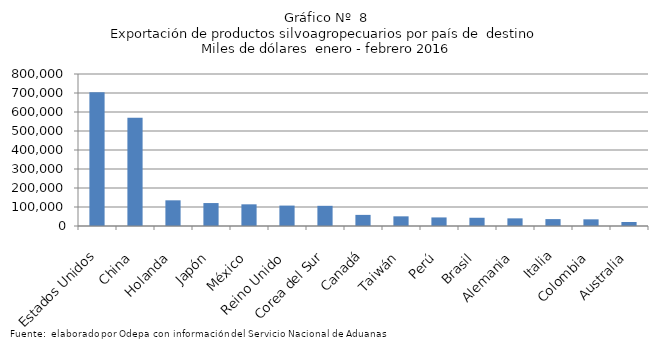
| Category | Series 0 |
|---|---|
| Estados Unidos | 704222.246 |
| China | 570098.945 |
| Holanda | 135188.003 |
| Japón | 120776.754 |
| México | 114056.644 |
| Reino Unido | 107442.036 |
| Corea del Sur | 106201.218 |
| Canadá | 58504.005 |
| Taiwán | 50855.639 |
| Perú | 45107.916 |
| Brasil | 43396.394 |
| Alemania | 40221.66 |
| Italia | 36282.705 |
| Colombia | 35107.759 |
| Australia | 21212.82 |